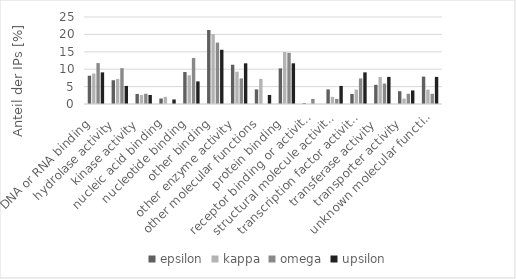
| Category | epsilon | kappa | omega | upsilon |
|---|---|---|---|---|
| DNA or RNA binding  | 8.136 | 8.763 | 11.765 | 9.091 |
| hydrolase activity  | 6.824 | 7.216 | 10.294 | 5.195 |
| kinase activity  | 2.887 | 2.577 | 2.941 | 2.597 |
| nucleic acid binding  | 1.575 | 2.062 | 0 | 1.299 |
| nucleotide binding  | 9.186 | 8.247 | 13.235 | 6.494 |
| other binding  | 21.26 | 20.103 | 17.647 | 15.584 |
| other enzyme activity  | 11.286 | 9.278 | 7.353 | 11.688 |
| other molecular functions  | 4.199 | 7.216 | 0 | 2.597 |
| protein binding  | 10.236 | 14.948 | 14.706 | 11.688 |
| receptor binding or activity  | 0.262 | 0 | 1.471 | 0 |
| structural molecule activity  | 4.199 | 2.062 | 1.471 | 5.195 |
| transcription factor activity  | 2.887 | 4.124 | 7.353 | 9.091 |
| transferase activity  | 5.512 | 7.732 | 5.882 | 7.792 |
| transporter activity  | 3.675 | 1.546 | 2.941 | 3.896 |
| unknown molecular functions  | 7.874 | 4.124 | 2.941 | 7.792 |